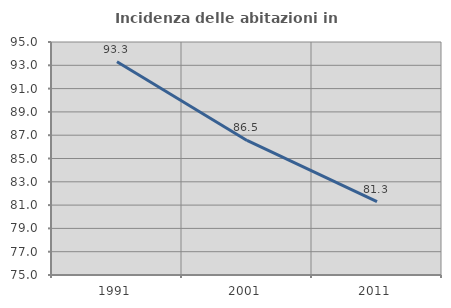
| Category | Incidenza delle abitazioni in proprietà  |
|---|---|
| 1991.0 | 93.299 |
| 2001.0 | 86.547 |
| 2011.0 | 81.304 |